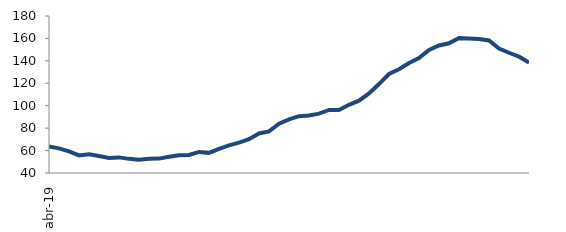
| Category | Series 0 |
|---|---|
| 2019-04-01 | 63.666 |
| 2019-05-01 | 61.943 |
| 2019-06-01 | 59.307 |
| 2019-07-01 | 55.7 |
| 2019-08-01 | 56.658 |
| 2019-09-01 | 55.107 |
| 2019-10-01 | 53.41 |
| 2019-11-01 | 53.924 |
| 2019-12-01 | 52.607 |
| 2020-01-01 | 51.869 |
| 2020-02-01 | 52.619 |
| 2020-03-01 | 52.83 |
| 2020-04-01 | 54.43 |
| 2020-05-01 | 55.851 |
| 2020-06-01 | 56.062 |
| 2020-07-01 | 58.766 |
| 2020-08-01 | 57.967 |
| 2020-09-01 | 61.563 |
| 2020-10-01 | 64.611 |
| 2020-11-01 | 67.053 |
| 2020-12-01 | 70.207 |
| 2021-01-01 | 75.283 |
| 2021-02-01 | 77.125 |
| 2021-03-01 | 83.917 |
| 2021-04-01 | 87.772 |
| 2021-05-01 | 90.698 |
| 2021-06-01 | 91.254 |
| 2021-07-01 | 92.957 |
| 2021-08-01 | 96.281 |
| 2021-09-01 | 96.228 |
| 2021-10-01 | 100.807 |
| 2021-11-01 | 104.506 |
| 2021-12-01 | 110.93 |
| 2022-01-01 | 119.29 |
| 2022-02-01 | 128.252 |
| 2022-03-01 | 132.457 |
| 2022-04-01 | 138.011 |
| 2022-05-01 | 142.591 |
| 2022-06-01 | 149.795 |
| 2022-07-01 | 153.681 |
| 2022-08-01 | 155.702 |
| 2022-09-01 | 160.456 |
| 2022-10-01 | 159.983 |
| 2022-11-01 | 159.553 |
| 2022-12-01 | 158.164 |
| 2023-01-01 | 151.047 |
| 2023-02-01 | 147.233 |
| 2023-03-01 | 143.736 |
| 2023-04-01 | 138.403 |